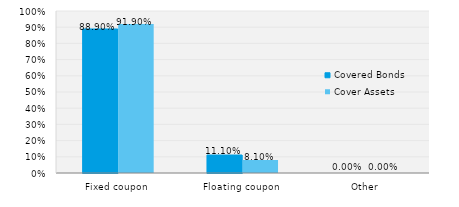
| Category | Covered Bonds | Cover Assets |
|---|---|---|
| Fixed coupon | 0.889 | 0.919 |
| Floating coupon | 0.111 | 0.081 |
| Other | 0 | 0 |